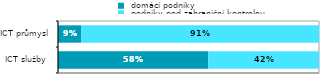
| Category |  domácí podniky |  podniky pod zahraniční kontrolou |
|---|---|---|
| ICT služby  | 0.576 | 0.424 |
| ICT průmysl | 0.09 | 0.91 |